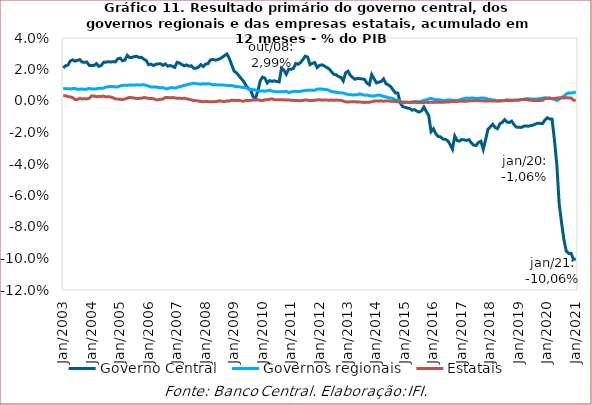
| Category | Governo Central | Governos regionais | Estatais |
|---|---|---|---|
| 2003-01-01 | 0.021 | 0.008 | 0.003 |
| 2003-02-01 | 0.022 | 0.008 | 0.003 |
| 2003-03-01 | 0.023 | 0.008 | 0.003 |
| 2003-04-01 | 0.025 | 0.008 | 0.003 |
| 2003-05-01 | 0.026 | 0.008 | 0.002 |
| 2003-06-01 | 0.025 | 0.008 | 0.001 |
| 2003-07-01 | 0.026 | 0.007 | 0.001 |
| 2003-08-01 | 0.026 | 0.008 | 0.002 |
| 2003-09-01 | 0.025 | 0.008 | 0.001 |
| 2003-10-01 | 0.025 | 0.007 | 0.001 |
| 2003-11-01 | 0.025 | 0.008 | 0.001 |
| 2003-12-01 | 0.023 | 0.008 | 0.002 |
| 2004-01-01 | 0.023 | 0.008 | 0.003 |
| 2004-02-01 | 0.023 | 0.008 | 0.003 |
| 2004-03-01 | 0.024 | 0.008 | 0.003 |
| 2004-04-01 | 0.022 | 0.008 | 0.003 |
| 2004-05-01 | 0.023 | 0.008 | 0.003 |
| 2004-06-01 | 0.025 | 0.008 | 0.003 |
| 2004-07-01 | 0.025 | 0.009 | 0.003 |
| 2004-08-01 | 0.025 | 0.009 | 0.003 |
| 2004-09-01 | 0.025 | 0.009 | 0.002 |
| 2004-10-01 | 0.025 | 0.009 | 0.002 |
| 2004-11-01 | 0.025 | 0.009 | 0.001 |
| 2004-12-01 | 0.027 | 0.009 | 0.001 |
| 2005-01-01 | 0.027 | 0.01 | 0.001 |
| 2005-02-01 | 0.026 | 0.01 | 0.001 |
| 2005-03-01 | 0.026 | 0.01 | 0.001 |
| 2005-04-01 | 0.029 | 0.01 | 0.002 |
| 2005-05-01 | 0.028 | 0.01 | 0.002 |
| 2005-06-01 | 0.028 | 0.01 | 0.002 |
| 2005-07-01 | 0.028 | 0.01 | 0.002 |
| 2005-08-01 | 0.028 | 0.01 | 0.002 |
| 2005-09-01 | 0.028 | 0.01 | 0.002 |
| 2005-10-01 | 0.028 | 0.01 | 0.002 |
| 2005-11-01 | 0.027 | 0.01 | 0.002 |
| 2005-12-01 | 0.026 | 0.01 | 0.002 |
| 2006-01-01 | 0.023 | 0.009 | 0.002 |
| 2006-02-01 | 0.023 | 0.009 | 0.002 |
| 2006-03-01 | 0.023 | 0.009 | 0.002 |
| 2006-04-01 | 0.023 | 0.009 | 0.001 |
| 2006-05-01 | 0.024 | 0.009 | 0.001 |
| 2006-06-01 | 0.024 | 0.008 | 0.001 |
| 2006-07-01 | 0.023 | 0.009 | 0.001 |
| 2006-08-01 | 0.024 | 0.008 | 0.002 |
| 2006-09-01 | 0.022 | 0.008 | 0.002 |
| 2006-10-01 | 0.023 | 0.008 | 0.002 |
| 2006-11-01 | 0.022 | 0.009 | 0.002 |
| 2006-12-01 | 0.021 | 0.008 | 0.002 |
| 2007-01-01 | 0.025 | 0.009 | 0.002 |
| 2007-02-01 | 0.024 | 0.009 | 0.002 |
| 2007-03-01 | 0.023 | 0.009 | 0.002 |
| 2007-04-01 | 0.022 | 0.01 | 0.002 |
| 2007-05-01 | 0.023 | 0.01 | 0.001 |
| 2007-06-01 | 0.022 | 0.011 | 0.001 |
| 2007-07-01 | 0.022 | 0.011 | 0.001 |
| 2007-08-01 | 0.021 | 0.011 | 0 |
| 2007-09-01 | 0.021 | 0.011 | 0 |
| 2007-10-01 | 0.021 | 0.011 | 0 |
| 2007-11-01 | 0.023 | 0.011 | 0 |
| 2007-12-01 | 0.022 | 0.011 | 0 |
| 2008-01-01 | 0.023 | 0.011 | 0 |
| 2008-02-01 | 0.024 | 0.011 | 0 |
| 2008-03-01 | 0.026 | 0.011 | -0.001 |
| 2008-04-01 | 0.026 | 0.01 | -0.001 |
| 2008-05-01 | 0.026 | 0.01 | 0 |
| 2008-06-01 | 0.026 | 0.01 | 0 |
| 2008-07-01 | 0.027 | 0.01 | 0 |
| 2008-08-01 | 0.028 | 0.01 | 0 |
| 2008-09-01 | 0.029 | 0.01 | 0 |
| 2008-10-01 | 0.03 | 0.01 | 0 |
| 2008-11-01 | 0.027 | 0.01 | 0 |
| 2008-12-01 | 0.023 | 0.01 | 0.001 |
| 2009-01-01 | 0.019 | 0.009 | 0 |
| 2009-02-01 | 0.018 | 0.009 | 0 |
| 2009-03-01 | 0.016 | 0.009 | 0 |
| 2009-04-01 | 0.014 | 0.009 | 0 |
| 2009-05-01 | 0.013 | 0.009 | 0 |
| 2009-06-01 | 0.01 | 0.008 | 0 |
| 2009-07-01 | 0.008 | 0.008 | 0 |
| 2009-08-01 | 0.007 | 0.007 | 0 |
| 2009-09-01 | 0.003 | 0.007 | 0.001 |
| 2009-10-01 | 0.002 | 0.007 | 0.001 |
| 2009-11-01 | 0.006 | 0.006 | 0.001 |
| 2009-12-01 | 0.013 | 0.006 | 0 |
| 2010-01-01 | 0.015 | 0.006 | 0 |
| 2010-02-01 | 0.015 | 0.006 | 0.001 |
| 2010-03-01 | 0.012 | 0.006 | 0.001 |
| 2010-04-01 | 0.013 | 0.007 | 0.001 |
| 2010-05-01 | 0.012 | 0.006 | 0.001 |
| 2010-06-01 | 0.013 | 0.006 | 0.001 |
| 2010-07-01 | 0.012 | 0.006 | 0.001 |
| 2010-08-01 | 0.012 | 0.006 | 0.001 |
| 2010-09-01 | 0.021 | 0.006 | 0.001 |
| 2010-10-01 | 0.02 | 0.006 | 0.001 |
| 2010-11-01 | 0.017 | 0.006 | 0.001 |
| 2010-12-01 | 0.02 | 0.005 | 0.001 |
| 2011-01-01 | 0.02 | 0.006 | 0 |
| 2011-02-01 | 0.021 | 0.006 | 0 |
| 2011-03-01 | 0.024 | 0.006 | 0 |
| 2011-04-01 | 0.023 | 0.006 | 0 |
| 2011-05-01 | 0.024 | 0.006 | 0 |
| 2011-06-01 | 0.026 | 0.006 | 0 |
| 2011-07-01 | 0.028 | 0.007 | 0.001 |
| 2011-08-01 | 0.028 | 0.007 | 0.001 |
| 2011-09-01 | 0.023 | 0.007 | 0 |
| 2011-10-01 | 0.024 | 0.007 | 0 |
| 2011-11-01 | 0.024 | 0.007 | 0 |
| 2011-12-01 | 0.021 | 0.008 | 0.001 |
| 2012-01-01 | 0.023 | 0.008 | 0.001 |
| 2012-02-01 | 0.023 | 0.008 | 0.001 |
| 2012-03-01 | 0.022 | 0.007 | 0.001 |
| 2012-04-01 | 0.021 | 0.007 | 0.001 |
| 2012-05-01 | 0.02 | 0.007 | 0 |
| 2012-06-01 | 0.019 | 0.006 | 0.001 |
| 2012-07-01 | 0.017 | 0.006 | 0 |
| 2012-08-01 | 0.017 | 0.006 | 0.001 |
| 2012-09-01 | 0.015 | 0.005 | 0 |
| 2012-10-01 | 0.015 | 0.005 | 0 |
| 2012-11-01 | 0.013 | 0.005 | 0 |
| 2012-12-01 | 0.018 | 0.004 | -0.001 |
| 2013-01-01 | 0.019 | 0.004 | -0.001 |
| 2013-02-01 | 0.016 | 0.004 | -0.001 |
| 2013-03-01 | 0.015 | 0.004 | 0 |
| 2013-04-01 | 0.014 | 0.004 | 0 |
| 2013-05-01 | 0.014 | 0.004 | -0.001 |
| 2013-06-01 | 0.014 | 0.005 | -0.001 |
| 2013-07-01 | 0.014 | 0.004 | -0.001 |
| 2013-08-01 | 0.014 | 0.004 | -0.001 |
| 2013-09-01 | 0.011 | 0.004 | -0.001 |
| 2013-10-01 | 0.01 | 0.003 | -0.001 |
| 2013-11-01 | 0.017 | 0.003 | 0 |
| 2013-12-01 | 0.014 | 0.003 | 0 |
| 2014-01-01 | 0.011 | 0.004 | 0 |
| 2014-02-01 | 0.012 | 0.004 | 0 |
| 2014-03-01 | 0.012 | 0.003 | 0 |
| 2014-04-01 | 0.014 | 0.003 | 0 |
| 2014-05-01 | 0.011 | 0.003 | 0 |
| 2014-06-01 | 0.01 | 0.002 | 0 |
| 2014-07-01 | 0.009 | 0.002 | 0 |
| 2014-08-01 | 0.007 | 0.002 | 0 |
| 2014-09-01 | 0.005 | 0.001 | 0 |
| 2014-10-01 | 0.005 | 0 | 0 |
| 2014-11-01 | -0.001 | 0 | 0 |
| 2014-12-01 | -0.004 | -0.001 | -0.001 |
| 2015-01-01 | -0.004 | -0.001 | -0.001 |
| 2015-02-01 | -0.005 | -0.001 | -0.001 |
| 2015-03-01 | -0.005 | -0.001 | -0.001 |
| 2015-04-01 | -0.006 | -0.001 | -0.001 |
| 2015-05-01 | -0.005 | 0 | -0.001 |
| 2015-06-01 | -0.006 | 0 | -0.001 |
| 2015-07-01 | -0.007 | -0.001 | -0.001 |
| 2015-08-01 | -0.006 | 0 | -0.001 |
| 2015-09-01 | -0.004 | 0 | -0.001 |
| 2015-10-01 | -0.007 | 0.001 | -0.001 |
| 2015-11-01 | -0.009 | 0.001 | -0.001 |
| 2015-12-01 | -0.019 | 0.002 | -0.001 |
| 2016-01-01 | -0.018 | 0.001 | -0.001 |
| 2016-02-01 | -0.021 | 0.001 | -0.001 |
| 2016-03-01 | -0.023 | 0.001 | -0.001 |
| 2016-04-01 | -0.023 | 0.001 | -0.001 |
| 2016-05-01 | -0.024 | 0 | -0.001 |
| 2016-06-01 | -0.024 | 0 | -0.001 |
| 2016-07-01 | -0.025 | 0.001 | -0.001 |
| 2016-08-01 | -0.028 | 0.001 | -0.001 |
| 2016-09-01 | -0.031 | 0.001 | 0 |
| 2016-10-01 | -0.022 | 0 | 0 |
| 2016-11-01 | -0.025 | 0 | 0 |
| 2016-12-01 | -0.025 | 0.001 | 0 |
| 2017-01-01 | -0.024 | 0.001 | 0 |
| 2017-02-01 | -0.025 | 0.002 | 0 |
| 2017-03-01 | -0.025 | 0.002 | 0 |
| 2017-04-01 | -0.025 | 0.002 | 0 |
| 2017-05-01 | -0.027 | 0.002 | 0 |
| 2017-06-01 | -0.028 | 0.002 | 0 |
| 2017-07-01 | -0.028 | 0.002 | 0 |
| 2017-08-01 | -0.026 | 0.002 | 0 |
| 2017-09-01 | -0.026 | 0.002 | 0 |
| 2017-10-01 | -0.031 | 0.002 | 0 |
| 2017-11-01 | -0.024 | 0.002 | 0 |
| 2017-12-01 | -0.018 | 0.001 | 0 |
| 2018-01-01 | -0.016 | 0.001 | 0 |
| 2018-02-01 | -0.015 | 0.001 | 0 |
| 2018-03-01 | -0.017 | 0.001 | 0 |
| 2018-04-01 | -0.018 | 0 | 0 |
| 2018-05-01 | -0.014 | 0 | 0 |
| 2018-06-01 | -0.014 | 0 | 0 |
| 2018-07-01 | -0.012 | 0 | 0 |
| 2018-08-01 | -0.013 | 0.001 | 0 |
| 2018-09-01 | -0.014 | 0.001 | 0 |
| 2018-10-01 | -0.013 | 0 | 0.001 |
| 2018-11-01 | -0.015 | 0 | 0 |
| 2018-12-01 | -0.017 | 0 | 0.001 |
| 2019-01-01 | -0.017 | 0.001 | 0.001 |
| 2019-02-01 | -0.017 | 0.001 | 0.001 |
| 2019-03-01 | -0.016 | 0.001 | 0.001 |
| 2019-04-01 | -0.016 | 0.002 | 0.001 |
| 2019-05-01 | -0.016 | 0.001 | 0.001 |
| 2019-06-01 | -0.016 | 0.001 | 0 |
| 2019-07-01 | -0.015 | 0.001 | 0 |
| 2019-08-01 | -0.015 | 0.001 | 0 |
| 2019-09-01 | -0.014 | 0.001 | 0 |
| 2019-10-01 | -0.014 | 0.002 | 0 |
| 2019-11-01 | -0.014 | 0.002 | 0 |
| 2019-12-01 | -0.012 | 0.002 | 0.002 |
| 2020-01-01 | -0.011 | 0.002 | 0.002 |
| 2020-02-01 | -0.011 | 0.002 | 0.002 |
| 2020-03-01 | -0.012 | 0.001 | 0.002 |
| 2020-04-01 | -0.025 | 0.001 | 0.002 |
| 2020-05-01 | -0.041 | 0 | 0.002 |
| 2020-06-01 | -0.065 | 0.001 | 0.002 |
| 2020-07-01 | -0.077 | 0.002 | 0.002 |
| 2020-08-01 | -0.088 | 0.003 | 0.002 |
| 2020-09-01 | -0.095 | 0.004 | 0.002 |
| 2020-10-01 | -0.097 | 0.005 | 0.002 |
| 2020-11-01 | -0.097 | 0.005 | 0.002 |
| 2020-12-01 | -0.1 | 0.005 | 0 |
| 2021-01-01 | -0.101 | 0.006 | 0 |